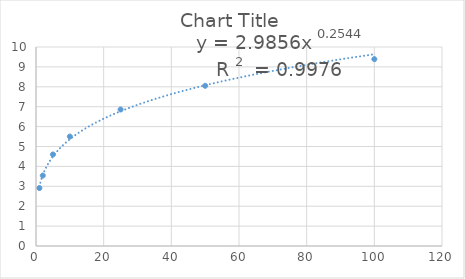
| Category | Series 0 |
|---|---|
| 1.0 | 2.91 |
| 2.0 | 3.54 |
| 5.0 | 4.6 |
| 10.0 | 5.5 |
| 25.0 | 6.86 |
| 50.0 | 8.05 |
| 100.0 | 9.39 |